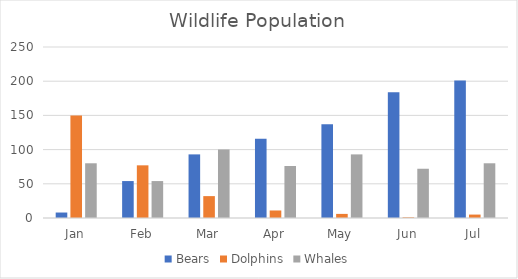
| Category | Bears | Dolphins | Whales |
|---|---|---|---|
| Jan | 8 | 150 | 80 |
| Feb | 54 | 77 | 54 |
| Mar | 93 | 32 | 100 |
| Apr | 116 | 11 | 76 |
| May | 137 | 6 | 93 |
| Jun | 184 | 1 | 72 |
| Jul | 201 | 5 | 80 |